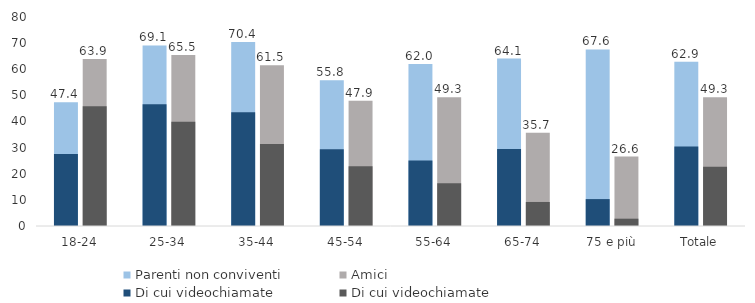
| Category | Parenti non conviventi | Amici |
|---|---|---|
| 18-24 | 47.4 | 63.9 |
| 25-34 | 69.1 | 65.5 |
| 35-44 | 70.4 | 61.5 |
| 45-54 | 55.8 | 47.9 |
| 55-64 | 62 | 49.3 |
| 65-74 | 64.1 | 35.7 |
| 75 e più | 67.6 | 26.6 |
| Totale | 62.9 | 49.3 |